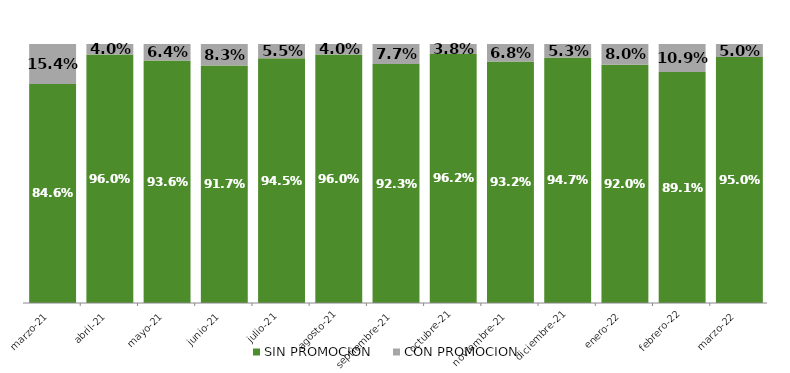
| Category | SIN PROMOCION   | CON PROMOCION   |
|---|---|---|
| 2021-03-01 | 0.846 | 0.154 |
| 2021-04-01 | 0.96 | 0.04 |
| 2021-05-01 | 0.936 | 0.064 |
| 2021-06-01 | 0.917 | 0.083 |
| 2021-07-01 | 0.945 | 0.055 |
| 2021-08-01 | 0.96 | 0.04 |
| 2021-09-01 | 0.923 | 0.077 |
| 2021-10-01 | 0.962 | 0.038 |
| 2021-11-01 | 0.932 | 0.068 |
| 2021-12-01 | 0.947 | 0.053 |
| 2022-01-01 | 0.92 | 0.08 |
| 2022-02-01 | 0.891 | 0.109 |
| 2022-03-01 | 0.95 | 0.05 |